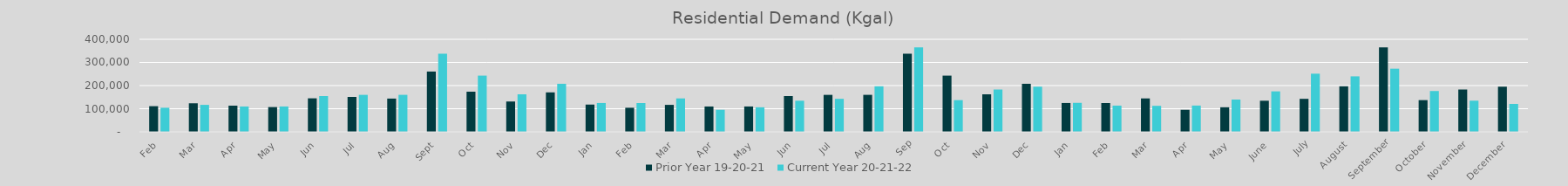
| Category | Prior Year 19-20-21 | Current Year 20-21-22 |
|---|---|---|
| Feb | 111009.962 | 104204.224 |
| Mar | 123525.131 | 116687.491 |
| Apr | 113258.787 | 109598.965 |
| May | 107128.051 | 109656.015 |
| Jun | 144930.453 | 154696.236 |
| Jul | 151028.014 | 159889.353 |
| Aug | 143816.337 | 160013.985 |
| Sep | 260607.456 | 337995.641 |
| Oct | 173601.368 | 243049.084 |
| Nov | 131198.833 | 162175.563 |
| Dec | 170629.384 | 207737.904 |
| Jan | 117899.625 | 124779.797 |
| Feb | 104204.224 | 124538.238 |
| Mar | 116687.491 | 144510.137 |
| Apr | 109598.965 | 95313.825 |
| May | 109656.015 | 106271.913 |
| Jun | 154696.236 | 134556.172 |
| Jul | 159889.353 | 142779.003 |
| Aug | 160013.985 | 196888.231 |
| Sep | 337995.641 | 364911.478 |
| Oct | 243049.084 | 137121.969 |
| Nov | 162175.563 | 182996.966 |
| Dec | 207737.904 | 195285.925 |
| Jan | 124779.797 | 125449.092 |
| Feb | 124538.238 | 113415.44 |
| Mar | 144510.137 | 112550.393 |
| Apr | 95313.825 | 113675.535 |
| May | 106271.913 | 139571.108 |
| June | 134556.172 | 175001.205 |
| July | 142779.003 | 251418.545 |
| August | 196888.231 | 239882.104 |
| September | 364911.478 | 272999.505 |
| October | 137121.969 | 176503.884 |
| November | 182996.966 | 134760.854 |
| December | 195285.925 | 120807.685 |